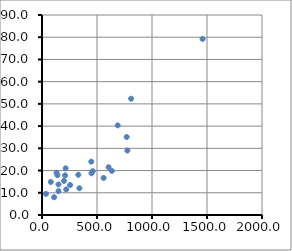
| Category | Series 0 |
|---|---|
| 560.0 | 16.68 |
| 220.0 | 11.5 |
| 340.0 | 12.03 |
| 80.0 | 14.88 |
| 150.0 | 13.75 |
| 330.0 | 18.11 |
| 110.0 | 8 |
| 210.0 | 17.83 |
| 1460.0 | 79.24 |
| 605.0 | 21.5 |
| 688.0 | 40.33 |
| 215.0 | 21 |
| 255.0 | 13.5 |
| 462.0 | 19.75 |
| 448.0 | 24 |
| 776.0 | 29 |
| 200.0 | 15.35 |
| 132.0 | 19 |
| 36.0 | 9.5 |
| 770.0 | 35.1 |
| 140.0 | 17.9 |
| 810.0 | 52.32 |
| 450.0 | 18.75 |
| 635.0 | 19.83 |
| 150.0 | 10.75 |